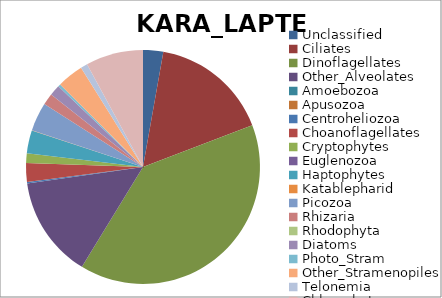
| Category | KARA_LAPTEV |
|---|---|
| Unclassified | 0.028 |
| Ciliates | 0.164 |
| Dinoflagellates | 0.396 |
| Other_Alveolates | 0.14 |
| Amoebozoa | 0 |
| Apusozoa | 0 |
| Centroheliozoa | 0.002 |
| Choanoflagellates | 0.026 |
| Cryptophytes | 0.013 |
| Euglenozoa | 0 |
| Haptophytes | 0.032 |
| Katablepharid | 0.001 |
| Picozoa | 0.039 |
| Rhizaria | 0.016 |
| Rhodophyta | 0 |
| Diatoms | 0.015 |
| Photo_Stram | 0.003 |
| Other_Stramenopiles | 0.036 |
| Telonemia | 0.009 |
| Chlorophytes | 0.079 |